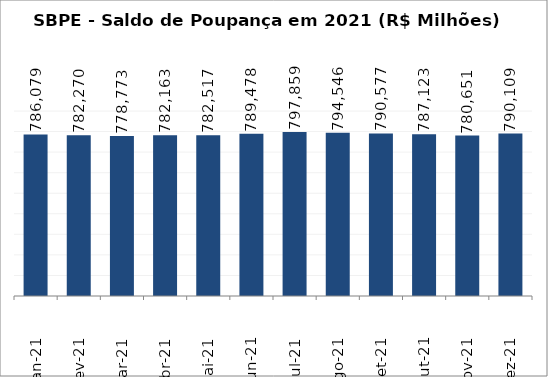
| Category | SBPE - Saldo de Poupança em 2021 (R$ Milhões) |
|---|---|
| Jan-21 | 786079.336 |
| Fev-21 | 782269.883 |
| Mar-21 | 778773.302 |
| Abr-21 | 782162.584 |
| Mai-21 | 782516.796 |
| Jun-21 | 789477.641 |
| Jul-21 | 797858.573 |
| Ago-21 | 794546.031 |
| Set-21 | 790576.524 |
| Out-21 | 787123.487 |
| Nov-21 | 780651.422 |
| Dez-21 | 790109.013 |